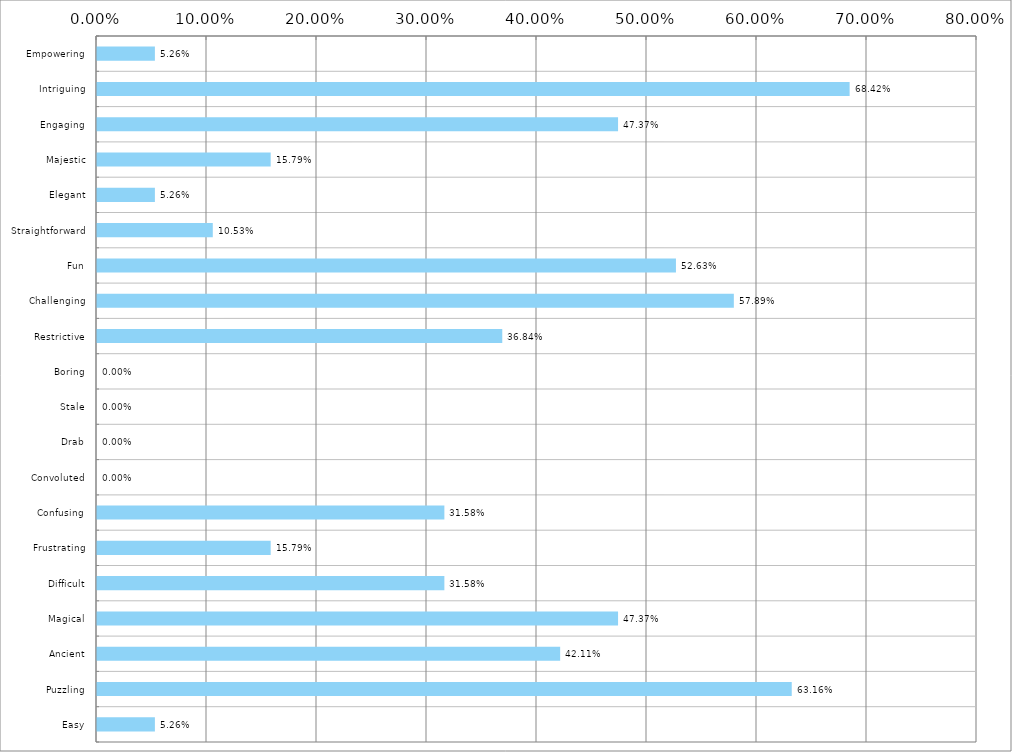
| Category | Total (% & freq col) |
|---|---|
| Empowering | 0.053 |
| Intriguing | 0.684 |
| Engaging | 0.474 |
| Majestic | 0.158 |
| Elegant | 0.053 |
| Straightforward | 0.105 |
| Fun | 0.526 |
| Challenging | 0.579 |
| Restrictive | 0.368 |
| Boring | 0 |
| Stale | 0 |
| Drab | 0 |
| Convoluted | 0 |
| Confusing | 0.316 |
| Frustrating | 0.158 |
| Difficult | 0.316 |
| Magical | 0.474 |
| Ancient | 0.421 |
| Puzzling | 0.632 |
| Easy | 0.053 |